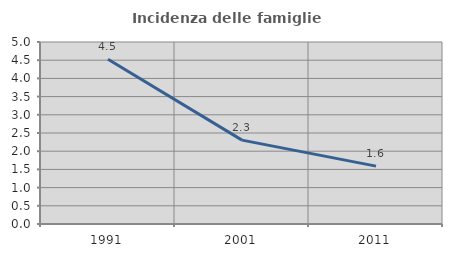
| Category | Incidenza delle famiglie numerose |
|---|---|
| 1991.0 | 4.524 |
| 2001.0 | 2.304 |
| 2011.0 | 1.59 |